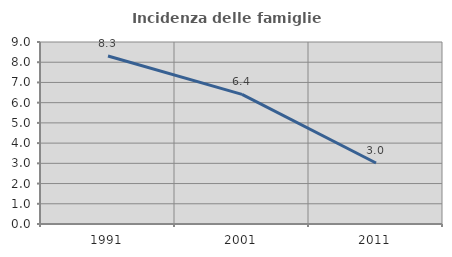
| Category | Incidenza delle famiglie numerose |
|---|---|
| 1991.0 | 8.307 |
| 2001.0 | 6.41 |
| 2011.0 | 3.016 |